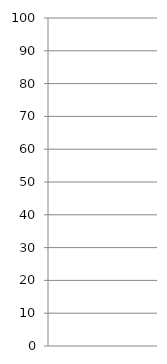
| Category | stijlflexibiliteit |
|---|---|
| 0 | 0 |